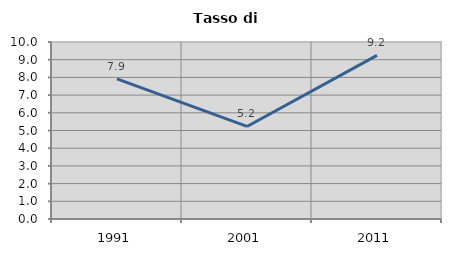
| Category | Tasso di disoccupazione   |
|---|---|
| 1991.0 | 7.919 |
| 2001.0 | 5.229 |
| 2011.0 | 9.243 |